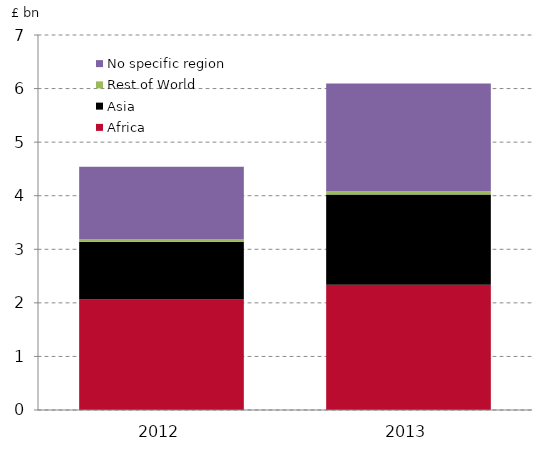
| Category | Africa | Asia | Rest of World | No specific region |
|---|---|---|---|---|
| 2012.0 | 2.061 | 1.08 | 0.053 | 1.348 |
| 2013.0 | 2.339 | 1.685 | 0.059 | 2.01 |